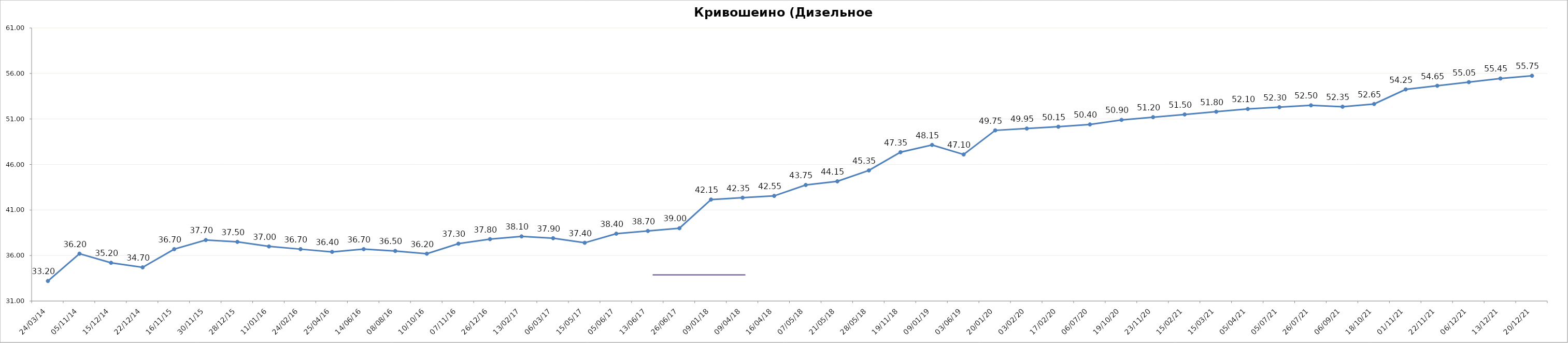
| Category | Series 0 |
|---|---|
| 2014-03-24 | 33.2 |
| 2014-11-05 | 36.2 |
| 2014-12-15 | 35.2 |
| 2014-12-22 | 34.7 |
| 2015-11-16 | 36.7 |
| 2015-11-30 | 37.7 |
| 2015-12-28 | 37.5 |
| 2016-01-11 | 37 |
| 2016-02-24 | 36.7 |
| 2016-04-25 | 36.4 |
| 2016-06-14 | 36.7 |
| 2016-08-08 | 36.5 |
| 2016-10-10 | 36.2 |
| 2016-11-07 | 37.3 |
| 2016-12-26 | 37.8 |
| 2017-02-13 | 38.1 |
| 2017-03-06 | 37.9 |
| 2017-05-15 | 37.4 |
| 2017-06-05 | 38.4 |
| 2017-06-13 | 38.7 |
| 2017-06-26 | 39 |
| 2018-01-09 | 42.15 |
| 2018-04-09 | 42.35 |
| 2018-04-16 | 42.55 |
| 2018-05-07 | 43.75 |
| 2018-05-21 | 44.15 |
| 2018-05-28 | 45.35 |
| 2018-11-19 | 47.35 |
| 2019-01-09 | 48.15 |
| 2019-06-03 | 47.1 |
| 2020-01-20 | 49.75 |
| 2020-02-03 | 49.95 |
| 2020-02-17 | 50.15 |
| 2020-07-06 | 50.4 |
| 2020-10-19 | 50.9 |
| 2020-11-23 | 51.2 |
| 2021-02-15 | 51.5 |
| 2021-03-15 | 51.8 |
| 2021-04-05 | 52.1 |
| 2021-07-05 | 52.3 |
| 2021-07-26 | 52.5 |
| 2021-09-06 | 52.35 |
| 2021-10-18 | 52.65 |
| 2021-11-01 | 54.25 |
| 2021-11-22 | 54.65 |
| 2021-12-06 | 55.05 |
| 2021-12-13 | 55.45 |
| 2021-12-20 | 55.75 |